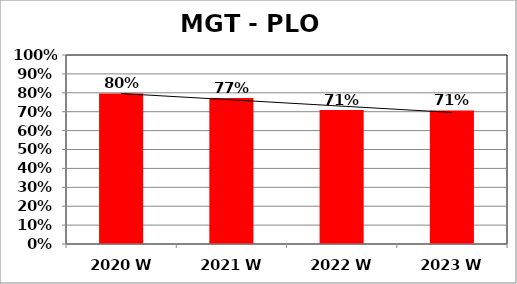
| Category | Series 0 |
|---|---|
| 2020 W | 0.797 |
| 2021 W | 0.772 |
| 2022 W | 0.709 |
| 2023 W | 0.707 |